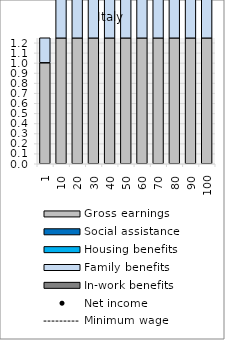
| Category | Gross earnings | Social assistance | Housing benefits | Family benefits | In-work benefits |
|---|---|---|---|---|---|
| 1.0 | 1.002 | 0 | 0 | 10.113 | 0 |
| 10.0 | 9.999 | 0 | 0 | 10.113 | 0 |
| 20.0 | 20.001 | 0 | 0 | 10.113 | 0 |
| 30.0 | 29.999 | 0 | 0 | 10.113 | 0 |
| 40.0 | 40.001 | 0 | 0 | 10.113 | 0 |
| 50.0 | 50 | 0 | 0 | 10.113 | 0 |
| 60.0 | 59.999 | 0 | 0 | 9.774 | 0 |
| 70.0 | 70.001 | 0 | 0 | 8.841 | 0 |
| 80.0 | 79.999 | 0 | 0 | 7.908 | 0 |
| 90.0 | 90.001 | 0 | 0 | 6.932 | 0 |
| 100.0 | 100 | 0 | 0 | 5.999 | 0 |